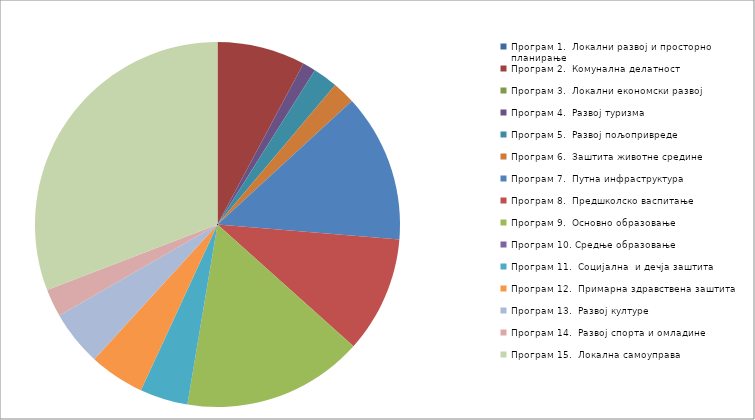
| Category | Series 0 |
|---|---|
| Програм 1.  Локални развој и просторно планирање | 0 |
| Програм 2.  Комунална делатност | 20380000 |
| Програм 3.  Локални економски развој | 0 |
| Програм 4.  Развој туризма | 3000000 |
| Програм 5.  Развој пољопривреде | 5750000 |
| Програм 6.  Заштита животне средине | 5260000 |
| Програм 7.  Путна инфраструктура | 34299000 |
| Програм 8.  Предшколско васпитање | 26917000 |
| Програм 9.  Основно образовање | 41815000 |
| Програм 10. Средње образовање | 0 |
| Програм 11.  Социјална  и дечја заштита | 11110000 |
| Програм 12.  Примарна здравствена заштита | 12785000 |
| Програм 13.  Развој културе | 12784000 |
| Програм 14.  Развој спорта и омладине | 6435000 |
| Програм 15.  Локална самоуправа | 80524000 |